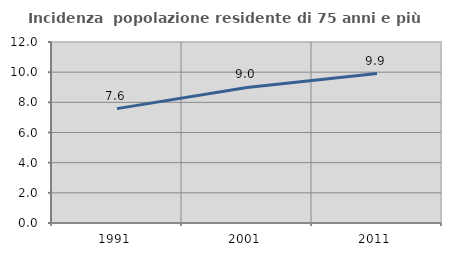
| Category | Incidenza  popolazione residente di 75 anni e più |
|---|---|
| 1991.0 | 7.583 |
| 2001.0 | 8.987 |
| 2011.0 | 9.904 |